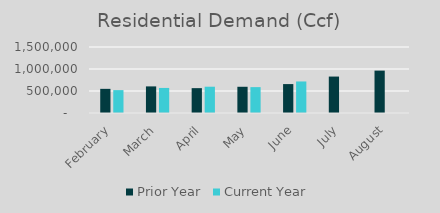
| Category | Prior Year | Current Year |
|---|---|---|
| February | 548904 | 520118 |
| March | 604606 | 569686 |
| April | 564867 | 597404.2 |
| May | 596051 | 588003 |
| June | 657143 | 716727.85 |
| July | 828101 | 0 |
| August | 963307 | 0 |